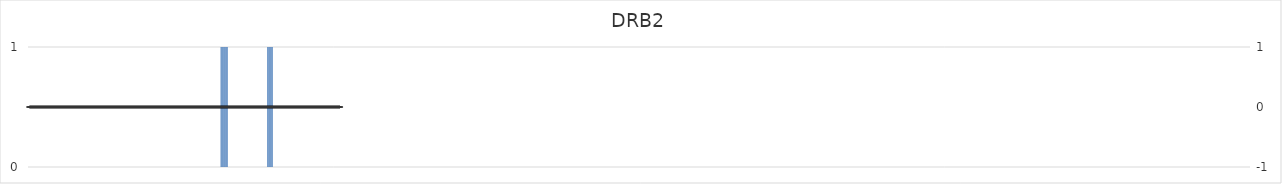
| Category | DRB2 |
|---|---|
| 1.0 | 0 |
| 2.0 | 0 |
| 3.0 | 0 |
| 4.0 | 0 |
| 5.0 | 0 |
| 6.0 | 0 |
| 7.0 | 0 |
| 8.0 | 0 |
| 9.0 | 0 |
| 10.0 | 0 |
| 11.0 | 0 |
| 12.0 | 0 |
| 13.0 | 0 |
| 14.0 | 0 |
| 15.0 | 0 |
| 16.0 | 0 |
| 17.0 | 0 |
| 18.0 | 0 |
| 19.0 | 0 |
| 20.0 | 0 |
| 21.0 | 0 |
| 22.0 | 0 |
| 23.0 | 0 |
| 24.0 | 0 |
| 25.0 | 0 |
| 26.0 | 0 |
| 27.0 | 0 |
| 28.0 | 0 |
| 29.0 | 0 |
| 30.0 | 0 |
| 31.0 | 0 |
| 32.0 | 0 |
| 33.0 | 0 |
| 34.0 | 0 |
| 35.0 | 0 |
| 36.0 | 0 |
| 37.0 | 0 |
| 38.0 | 0 |
| 39.0 | 0 |
| 40.0 | 0 |
| 41.0 | 0 |
| 42.0 | 0 |
| 43.0 | 0 |
| 44.0 | 0 |
| 45.0 | 0 |
| 46.0 | 0 |
| 47.0 | 0 |
| 48.0 | 0 |
| 49.0 | 0 |
| 50.0 | 0 |
| 51.0 | 0 |
| 52.0 | 0 |
| 53.0 | 0 |
| 54.0 | 0 |
| 55.0 | 0 |
| 56.0 | 0 |
| 57.0 | 0 |
| 58.0 | 0 |
| 59.0 | 0 |
| 60.0 | 0 |
| 61.0 | 0 |
| 62.0 | 0 |
| 63.0 | 0 |
| 64.0 | 0 |
| 65.0 | 0 |
| 66.0 | 0 |
| 67.0 | 0 |
| 68.0 | 0 |
| 69.0 | 0 |
| 70.0 | 0 |
| 71.0 | 0 |
| 72.0 | 0 |
| 73.0 | 0 |
| 74.0 | 0 |
| 75.0 | 0 |
| 76.0 | 0 |
| 77.0 | 0 |
| 78.0 | 0 |
| 79.0 | 0 |
| 80.0 | 0 |
| 81.0 | 0 |
| 82.0 | 0 |
| 83.0 | 0 |
| 84.0 | 0 |
| 85.0 | 0 |
| 86.0 | 0 |
| 87.0 | 0 |
| 88.0 | 0 |
| 89.0 | 0 |
| 90.0 | 0 |
| 91.0 | 0 |
| 92.0 | 0 |
| 93.0 | 0 |
| 94.0 | 0 |
| 95.0 | 0 |
| 96.0 | 0 |
| 97.0 | 0 |
| 98.0 | 0 |
| 99.0 | 0 |
| 100.0 | 0 |
| 101.0 | 0 |
| 102.0 | 0 |
| 103.0 | 0 |
| 104.0 | 0 |
| 105.0 | 0 |
| 106.0 | 0 |
| 107.0 | 0 |
| 108.0 | 0 |
| 109.0 | 0 |
| 110.0 | 0 |
| 111.0 | 0 |
| 112.0 | 0 |
| 113.0 | 0 |
| 114.0 | 0 |
| 115.0 | 0 |
| 116.0 | 0 |
| 117.0 | 0 |
| 118.0 | 0 |
| 119.0 | 0 |
| 120.0 | 0 |
| 121.0 | 0 |
| 122.0 | 0 |
| 123.0 | 0 |
| 124.0 | 0 |
| 125.0 | 0 |
| 126.0 | 0 |
| 127.0 | 0 |
| 128.0 | 0 |
| 129.0 | 0 |
| 130.0 | 0 |
| 131.0 | 0 |
| 132.0 | 0 |
| 133.0 | 0 |
| 134.0 | 0 |
| 135.0 | 0 |
| 136.0 | 0 |
| 137.0 | 0 |
| 138.0 | 0 |
| 139.0 | 0 |
| 140.0 | 0 |
| 141.0 | 0 |
| 142.0 | 0 |
| 143.0 | 0 |
| 144.0 | 0 |
| 145.0 | 0 |
| 146.0 | 0 |
| 147.0 | 0 |
| 148.0 | 0 |
| 149.0 | 0 |
| 150.0 | 0 |
| 151.0 | 0 |
| 152.0 | 0 |
| 153.0 | 0 |
| 154.0 | 0 |
| 155.0 | 0 |
| 156.0 | 0 |
| 157.0 | 0 |
| 158.0 | 0 |
| 159.0 | 0 |
| 160.0 | 0 |
| 161.0 | 0 |
| 162.0 | 0 |
| 163.0 | 0 |
| 164.0 | 0 |
| 165.0 | 0 |
| 166.0 | 0 |
| 167.0 | 0 |
| 168.0 | 0 |
| 169.0 | 0 |
| 170.0 | 0 |
| 171.0 | 0 |
| 172.0 | 0 |
| 173.0 | 0 |
| 174.0 | 0 |
| 175.0 | 0 |
| 176.0 | 0 |
| 177.0 | 0 |
| 178.0 | 0 |
| 179.0 | 0 |
| 180.0 | 0 |
| 181.0 | 0 |
| 182.0 | 0 |
| 183.0 | 0 |
| 184.0 | 0 |
| 185.0 | 0 |
| 186.0 | 0 |
| 187.0 | 0 |
| 188.0 | 0 |
| 189.0 | 0 |
| 190.0 | 0 |
| 191.0 | 0 |
| 192.0 | 0 |
| 193.0 | 0 |
| 194.0 | 0 |
| 195.0 | 0 |
| 196.0 | 0 |
| 197.0 | 0 |
| 198.0 | 0 |
| 199.0 | 0 |
| 200.0 | 0 |
| 201.0 | 0 |
| 202.0 | 0 |
| 203.0 | 0 |
| 204.0 | 0 |
| 205.0 | 0 |
| 206.0 | 0 |
| 207.0 | 0 |
| 208.0 | 0 |
| 209.0 | 0 |
| 210.0 | 0 |
| 211.0 | 0 |
| 212.0 | 0 |
| 213.0 | 0 |
| 214.0 | 0 |
| 215.0 | 0 |
| 216.0 | 0 |
| 217.0 | 0 |
| 218.0 | 0 |
| 219.0 | 0 |
| 220.0 | 0 |
| 221.0 | 0 |
| 222.0 | 0 |
| 223.0 | 0 |
| 224.0 | 0 |
| 225.0 | 0 |
| 226.0 | 0 |
| 227.0 | 0 |
| 228.0 | 0 |
| 229.0 | 0 |
| 230.0 | 0 |
| 231.0 | 0 |
| 232.0 | 0 |
| 233.0 | 0 |
| 234.0 | 0 |
| 235.0 | 0 |
| 236.0 | 0 |
| 237.0 | 0 |
| 238.0 | 0 |
| 239.0 | 0 |
| 240.0 | 0 |
| 241.0 | 0 |
| 242.0 | 0 |
| 243.0 | 0 |
| 244.0 | 0 |
| 245.0 | 0 |
| 246.0 | 0 |
| 247.0 | 0 |
| 248.0 | 0 |
| 249.0 | 0 |
| 250.0 | 0 |
| 251.0 | 0 |
| 252.0 | 0 |
| 253.0 | 0 |
| 254.0 | 0 |
| 255.0 | 0 |
| 256.0 | 0 |
| 257.0 | 0 |
| 258.0 | 0 |
| 259.0 | 0 |
| 260.0 | 0 |
| 261.0 | 0 |
| 262.0 | 0 |
| 263.0 | 0 |
| 264.0 | 0 |
| 265.0 | 0 |
| 266.0 | 0 |
| 267.0 | 0 |
| 268.0 | 0 |
| 269.0 | 0 |
| 270.0 | 1 |
| 271.0 | 1 |
| 272.0 | 1 |
| 273.0 | 1 |
| 274.0 | 1 |
| 275.0 | 1 |
| 276.0 | 1 |
| 277.0 | 1 |
| 278.0 | 1 |
| 279.0 | 1 |
| 280.0 | 0 |
| 281.0 | 0 |
| 282.0 | 0 |
| 283.0 | 0 |
| 284.0 | 0 |
| 285.0 | 0 |
| 286.0 | 0 |
| 287.0 | 0 |
| 288.0 | 0 |
| 289.0 | 0 |
| 290.0 | 0 |
| 291.0 | 0 |
| 292.0 | 0 |
| 293.0 | 0 |
| 294.0 | 0 |
| 295.0 | 0 |
| 296.0 | 0 |
| 297.0 | 0 |
| 298.0 | 0 |
| 299.0 | 0 |
| 300.0 | 0 |
| 301.0 | 0 |
| 302.0 | 0 |
| 303.0 | 0 |
| 304.0 | 0 |
| 305.0 | 0 |
| 306.0 | 0 |
| 307.0 | 0 |
| 308.0 | 0 |
| 309.0 | 0 |
| 310.0 | 0 |
| 311.0 | 0 |
| 312.0 | 0 |
| 313.0 | 0 |
| 314.0 | 0 |
| 315.0 | 0 |
| 316.0 | 0 |
| 317.0 | 0 |
| 318.0 | 0 |
| 319.0 | 0 |
| 320.0 | 0 |
| 321.0 | 0 |
| 322.0 | 0 |
| 323.0 | 0 |
| 324.0 | 0 |
| 325.0 | 0 |
| 326.0 | 0 |
| 327.0 | 0 |
| 328.0 | 0 |
| 329.0 | 0 |
| 330.0 | 0 |
| 331.0 | 0 |
| 332.0 | 0 |
| 333.0 | 0 |
| 334.0 | 0 |
| 335.0 | 1 |
| 336.0 | 1 |
| 337.0 | 1 |
| 338.0 | 1 |
| 339.0 | 1 |
| 340.0 | 1 |
| 341.0 | 1 |
| 342.0 | 1 |
| 343.0 | 0 |
| 344.0 | 0 |
| 345.0 | 0 |
| 346.0 | 0 |
| 347.0 | 0 |
| 348.0 | 0 |
| 349.0 | 0 |
| 350.0 | 0 |
| 351.0 | 0 |
| 352.0 | 0 |
| 353.0 | 0 |
| 354.0 | 0 |
| 355.0 | 0 |
| 356.0 | 0 |
| 357.0 | 0 |
| 358.0 | 0 |
| 359.0 | 0 |
| 360.0 | 0 |
| 361.0 | 0 |
| 362.0 | 0 |
| 363.0 | 0 |
| 364.0 | 0 |
| 365.0 | 0 |
| 366.0 | 0 |
| 367.0 | 0 |
| 368.0 | 0 |
| 369.0 | 0 |
| 370.0 | 0 |
| 371.0 | 0 |
| 372.0 | 0 |
| 373.0 | 0 |
| 374.0 | 0 |
| 375.0 | 0 |
| 376.0 | 0 |
| 377.0 | 0 |
| 378.0 | 0 |
| 379.0 | 0 |
| 380.0 | 0 |
| 381.0 | 0 |
| 382.0 | 0 |
| 383.0 | 0 |
| 384.0 | 0 |
| 385.0 | 0 |
| 386.0 | 0 |
| 387.0 | 0 |
| 388.0 | 0 |
| 389.0 | 0 |
| 390.0 | 0 |
| 391.0 | 0 |
| 392.0 | 0 |
| 393.0 | 0 |
| 394.0 | 0 |
| 395.0 | 0 |
| 396.0 | 0 |
| 397.0 | 0 |
| 398.0 | 0 |
| 399.0 | 0 |
| 400.0 | 0 |
| 401.0 | 0 |
| 402.0 | 0 |
| 403.0 | 0 |
| 404.0 | 0 |
| 405.0 | 0 |
| 406.0 | 0 |
| 407.0 | 0 |
| 408.0 | 0 |
| 409.0 | 0 |
| 410.0 | 0 |
| 411.0 | 0 |
| 412.0 | 0 |
| 413.0 | 0 |
| 414.0 | 0 |
| 415.0 | 0 |
| 416.0 | 0 |
| 417.0 | 0 |
| 418.0 | 0 |
| 419.0 | 0 |
| 420.0 | 0 |
| 421.0 | 0 |
| 422.0 | 0 |
| 423.0 | 0 |
| 424.0 | 0 |
| 425.0 | 0 |
| 426.0 | 0 |
| 427.0 | 0 |
| 428.0 | 0 |
| 429.0 | 0 |
| 430.0 | 0 |
| 431.0 | 0 |
| 432.0 | 0 |
| 433.0 | 0 |
| 434.0 | 0 |
| 435.0 | 0 |
| 436.0 | 0 |
| 437.0 | 0 |
| 438.0 | 0 |
| 439.0 | 0 |
| 440.0 | 0 |
| 441.0 | 0 |
| 442.0 | 0 |
| 443.0 | 0 |
| 444.0 | 0 |
| 445.0 | 0 |
| 446.0 | 0 |
| 447.0 | 0 |
| 448.0 | 0 |
| 449.0 | 0 |
| 450.0 | 0 |
| 451.0 | 0 |
| 452.0 | 0 |
| 453.0 | 0 |
| 454.0 | 0 |
| 455.0 | 0 |
| 456.0 | 0 |
| 457.0 | 0 |
| 458.0 | 0 |
| 459.0 | 0 |
| 460.0 | 0 |
| 461.0 | 0 |
| 462.0 | 0 |
| 463.0 | 0 |
| 464.0 | 0 |
| 465.0 | 0 |
| 466.0 | 0 |
| 467.0 | 0 |
| 468.0 | 0 |
| 469.0 | 0 |
| 470.0 | 0 |
| 471.0 | 0 |
| 472.0 | 0 |
| 473.0 | 0 |
| 474.0 | 0 |
| 475.0 | 0 |
| 476.0 | 0 |
| 477.0 | 0 |
| 478.0 | 0 |
| 479.0 | 0 |
| 480.0 | 0 |
| 481.0 | 0 |
| 482.0 | 0 |
| 483.0 | 0 |
| 484.0 | 0 |
| 485.0 | 0 |
| 486.0 | 0 |
| 487.0 | 0 |
| 488.0 | 0 |
| 489.0 | 0 |
| 490.0 | 0 |
| 491.0 | 0 |
| 492.0 | 0 |
| 493.0 | 0 |
| 494.0 | 0 |
| 495.0 | 0 |
| 496.0 | 0 |
| 497.0 | 0 |
| 498.0 | 0 |
| 499.0 | 0 |
| 500.0 | 0 |
| 501.0 | 0 |
| 502.0 | 0 |
| 503.0 | 0 |
| 504.0 | 0 |
| 505.0 | 0 |
| 506.0 | 0 |
| 507.0 | 0 |
| 508.0 | 0 |
| 509.0 | 0 |
| 510.0 | 0 |
| 511.0 | 0 |
| 512.0 | 0 |
| 513.0 | 0 |
| 514.0 | 0 |
| 515.0 | 0 |
| 516.0 | 0 |
| 517.0 | 0 |
| 518.0 | 0 |
| 519.0 | 0 |
| 520.0 | 0 |
| 521.0 | 0 |
| 522.0 | 0 |
| 523.0 | 0 |
| 524.0 | 0 |
| 525.0 | 0 |
| 526.0 | 0 |
| 527.0 | 0 |
| 528.0 | 0 |
| 529.0 | 0 |
| 530.0 | 0 |
| 531.0 | 0 |
| 532.0 | 0 |
| 533.0 | 0 |
| 534.0 | 0 |
| 535.0 | 0 |
| 536.0 | 0 |
| 537.0 | 0 |
| 538.0 | 0 |
| 539.0 | 0 |
| 540.0 | 0 |
| 541.0 | 0 |
| 542.0 | 0 |
| 543.0 | 0 |
| 544.0 | 0 |
| 545.0 | 0 |
| 546.0 | 0 |
| 547.0 | 0 |
| 548.0 | 0 |
| 549.0 | 0 |
| 550.0 | 0 |
| 551.0 | 0 |
| 552.0 | 0 |
| 553.0 | 0 |
| 554.0 | 0 |
| 555.0 | 0 |
| 556.0 | 0 |
| 557.0 | 0 |
| 558.0 | 0 |
| 559.0 | 0 |
| 560.0 | 0 |
| 561.0 | 0 |
| 562.0 | 0 |
| 563.0 | 0 |
| 564.0 | 0 |
| 565.0 | 0 |
| 566.0 | 0 |
| 567.0 | 0 |
| 568.0 | 0 |
| 569.0 | 0 |
| 570.0 | 0 |
| 571.0 | 0 |
| 572.0 | 0 |
| 573.0 | 0 |
| 574.0 | 0 |
| 575.0 | 0 |
| 576.0 | 0 |
| 577.0 | 0 |
| 578.0 | 0 |
| 579.0 | 0 |
| 580.0 | 0 |
| 581.0 | 0 |
| 582.0 | 0 |
| 583.0 | 0 |
| 584.0 | 0 |
| 585.0 | 0 |
| 586.0 | 0 |
| 587.0 | 0 |
| 588.0 | 0 |
| 589.0 | 0 |
| 590.0 | 0 |
| 591.0 | 0 |
| 592.0 | 0 |
| 593.0 | 0 |
| 594.0 | 0 |
| 595.0 | 0 |
| 596.0 | 0 |
| 597.0 | 0 |
| 598.0 | 0 |
| 599.0 | 0 |
| 600.0 | 0 |
| 601.0 | 0 |
| 602.0 | 0 |
| 603.0 | 0 |
| 604.0 | 0 |
| 605.0 | 0 |
| 606.0 | 0 |
| 607.0 | 0 |
| 608.0 | 0 |
| 609.0 | 0 |
| 610.0 | 0 |
| 611.0 | 0 |
| 612.0 | 0 |
| 613.0 | 0 |
| 614.0 | 0 |
| 615.0 | 0 |
| 616.0 | 0 |
| 617.0 | 0 |
| 618.0 | 0 |
| 619.0 | 0 |
| 620.0 | 0 |
| 621.0 | 0 |
| 622.0 | 0 |
| 623.0 | 0 |
| 624.0 | 0 |
| 625.0 | 0 |
| 626.0 | 0 |
| 627.0 | 0 |
| 628.0 | 0 |
| 629.0 | 0 |
| 630.0 | 0 |
| 631.0 | 0 |
| 632.0 | 0 |
| 633.0 | 0 |
| 634.0 | 0 |
| 635.0 | 0 |
| 636.0 | 0 |
| 637.0 | 0 |
| 638.0 | 0 |
| 639.0 | 0 |
| 640.0 | 0 |
| 641.0 | 0 |
| 642.0 | 0 |
| 643.0 | 0 |
| 644.0 | 0 |
| 645.0 | 0 |
| 646.0 | 0 |
| 647.0 | 0 |
| 648.0 | 0 |
| 649.0 | 0 |
| 650.0 | 0 |
| 651.0 | 0 |
| 652.0 | 0 |
| 653.0 | 0 |
| 654.0 | 0 |
| 655.0 | 0 |
| 656.0 | 0 |
| 657.0 | 0 |
| 658.0 | 0 |
| 659.0 | 0 |
| 660.0 | 0 |
| 661.0 | 0 |
| 662.0 | 0 |
| 663.0 | 0 |
| 664.0 | 0 |
| 665.0 | 0 |
| 666.0 | 0 |
| 667.0 | 0 |
| 668.0 | 0 |
| 669.0 | 0 |
| 670.0 | 0 |
| 671.0 | 0 |
| 672.0 | 0 |
| 673.0 | 0 |
| 674.0 | 0 |
| 675.0 | 0 |
| 676.0 | 0 |
| 677.0 | 0 |
| 678.0 | 0 |
| 679.0 | 0 |
| 680.0 | 0 |
| 681.0 | 0 |
| 682.0 | 0 |
| 683.0 | 0 |
| 684.0 | 0 |
| 685.0 | 0 |
| 686.0 | 0 |
| 687.0 | 0 |
| 688.0 | 0 |
| 689.0 | 0 |
| 690.0 | 0 |
| 691.0 | 0 |
| 692.0 | 0 |
| 693.0 | 0 |
| 694.0 | 0 |
| 695.0 | 0 |
| 696.0 | 0 |
| 697.0 | 0 |
| 698.0 | 0 |
| 699.0 | 0 |
| 700.0 | 0 |
| 701.0 | 0 |
| 702.0 | 0 |
| 703.0 | 0 |
| 704.0 | 0 |
| 705.0 | 0 |
| 706.0 | 0 |
| 707.0 | 0 |
| 708.0 | 0 |
| 709.0 | 0 |
| 710.0 | 0 |
| 711.0 | 0 |
| 712.0 | 0 |
| 713.0 | 0 |
| 714.0 | 0 |
| 715.0 | 0 |
| 716.0 | 0 |
| 717.0 | 0 |
| 718.0 | 0 |
| 719.0 | 0 |
| 720.0 | 0 |
| 721.0 | 0 |
| 722.0 | 0 |
| 723.0 | 0 |
| 724.0 | 0 |
| 725.0 | 0 |
| 726.0 | 0 |
| 727.0 | 0 |
| 728.0 | 0 |
| 729.0 | 0 |
| 730.0 | 0 |
| 731.0 | 0 |
| 732.0 | 0 |
| 733.0 | 0 |
| 734.0 | 0 |
| 735.0 | 0 |
| 736.0 | 0 |
| 737.0 | 0 |
| 738.0 | 0 |
| 739.0 | 0 |
| 740.0 | 0 |
| 741.0 | 0 |
| 742.0 | 0 |
| 743.0 | 0 |
| 744.0 | 0 |
| 745.0 | 0 |
| 746.0 | 0 |
| 747.0 | 0 |
| 748.0 | 0 |
| 749.0 | 0 |
| 750.0 | 0 |
| 751.0 | 0 |
| 752.0 | 0 |
| 753.0 | 0 |
| 754.0 | 0 |
| 755.0 | 0 |
| 756.0 | 0 |
| 757.0 | 0 |
| 758.0 | 0 |
| 759.0 | 0 |
| 760.0 | 0 |
| 761.0 | 0 |
| 762.0 | 0 |
| 763.0 | 0 |
| 764.0 | 0 |
| 765.0 | 0 |
| 766.0 | 0 |
| 767.0 | 0 |
| 768.0 | 0 |
| 769.0 | 0 |
| 770.0 | 0 |
| 771.0 | 0 |
| 772.0 | 0 |
| 773.0 | 0 |
| 774.0 | 0 |
| 775.0 | 0 |
| 776.0 | 0 |
| 777.0 | 0 |
| 778.0 | 0 |
| 779.0 | 0 |
| 780.0 | 0 |
| 781.0 | 0 |
| 782.0 | 0 |
| 783.0 | 0 |
| 784.0 | 0 |
| 785.0 | 0 |
| 786.0 | 0 |
| 787.0 | 0 |
| 788.0 | 0 |
| 789.0 | 0 |
| 790.0 | 0 |
| 791.0 | 0 |
| 792.0 | 0 |
| 793.0 | 0 |
| 794.0 | 0 |
| 795.0 | 0 |
| 796.0 | 0 |
| 797.0 | 0 |
| 798.0 | 0 |
| 799.0 | 0 |
| 800.0 | 0 |
| 801.0 | 0 |
| 802.0 | 0 |
| 803.0 | 0 |
| 804.0 | 0 |
| 805.0 | 0 |
| 806.0 | 0 |
| 807.0 | 0 |
| 808.0 | 0 |
| 809.0 | 0 |
| 810.0 | 0 |
| 811.0 | 0 |
| 812.0 | 0 |
| 813.0 | 0 |
| 814.0 | 0 |
| 815.0 | 0 |
| 816.0 | 0 |
| 817.0 | 0 |
| 818.0 | 0 |
| 819.0 | 0 |
| 820.0 | 0 |
| 821.0 | 0 |
| 822.0 | 0 |
| 823.0 | 0 |
| 824.0 | 0 |
| 825.0 | 0 |
| 826.0 | 0 |
| 827.0 | 0 |
| 828.0 | 0 |
| 829.0 | 0 |
| 830.0 | 0 |
| 831.0 | 0 |
| 832.0 | 0 |
| 833.0 | 0 |
| 834.0 | 0 |
| 835.0 | 0 |
| 836.0 | 0 |
| 837.0 | 0 |
| 838.0 | 0 |
| 839.0 | 0 |
| 840.0 | 0 |
| 841.0 | 0 |
| 842.0 | 0 |
| 843.0 | 0 |
| 844.0 | 0 |
| 845.0 | 0 |
| 846.0 | 0 |
| 847.0 | 0 |
| 848.0 | 0 |
| 849.0 | 0 |
| 850.0 | 0 |
| 851.0 | 0 |
| 852.0 | 0 |
| 853.0 | 0 |
| 854.0 | 0 |
| 855.0 | 0 |
| 856.0 | 0 |
| 857.0 | 0 |
| 858.0 | 0 |
| 859.0 | 0 |
| 860.0 | 0 |
| 861.0 | 0 |
| 862.0 | 0 |
| 863.0 | 0 |
| 864.0 | 0 |
| 865.0 | 0 |
| 866.0 | 0 |
| 867.0 | 0 |
| 868.0 | 0 |
| 869.0 | 0 |
| 870.0 | 0 |
| 871.0 | 0 |
| 872.0 | 0 |
| 873.0 | 0 |
| 874.0 | 0 |
| 875.0 | 0 |
| 876.0 | 0 |
| 877.0 | 0 |
| 878.0 | 0 |
| 879.0 | 0 |
| 880.0 | 0 |
| 881.0 | 0 |
| 882.0 | 0 |
| 883.0 | 0 |
| 884.0 | 0 |
| 885.0 | 0 |
| 886.0 | 0 |
| 887.0 | 0 |
| 888.0 | 0 |
| 889.0 | 0 |
| 890.0 | 0 |
| 891.0 | 0 |
| 892.0 | 0 |
| 893.0 | 0 |
| 894.0 | 0 |
| 895.0 | 0 |
| 896.0 | 0 |
| 897.0 | 0 |
| 898.0 | 0 |
| 899.0 | 0 |
| 900.0 | 0 |
| 901.0 | 0 |
| 902.0 | 0 |
| 903.0 | 0 |
| 904.0 | 0 |
| 905.0 | 0 |
| 906.0 | 0 |
| 907.0 | 0 |
| 908.0 | 0 |
| 909.0 | 0 |
| 910.0 | 0 |
| 911.0 | 0 |
| 912.0 | 0 |
| 913.0 | 0 |
| 914.0 | 0 |
| 915.0 | 0 |
| 916.0 | 0 |
| 917.0 | 0 |
| 918.0 | 0 |
| 919.0 | 0 |
| 920.0 | 0 |
| 921.0 | 0 |
| 922.0 | 0 |
| 923.0 | 0 |
| 924.0 | 0 |
| 925.0 | 0 |
| 926.0 | 0 |
| 927.0 | 0 |
| 928.0 | 0 |
| 929.0 | 0 |
| 930.0 | 0 |
| 931.0 | 0 |
| 932.0 | 0 |
| 933.0 | 0 |
| 934.0 | 0 |
| 935.0 | 0 |
| 936.0 | 0 |
| 937.0 | 0 |
| 938.0 | 0 |
| 939.0 | 0 |
| 940.0 | 0 |
| 941.0 | 0 |
| 942.0 | 0 |
| 943.0 | 0 |
| 944.0 | 0 |
| 945.0 | 0 |
| 946.0 | 0 |
| 947.0 | 0 |
| 948.0 | 0 |
| 949.0 | 0 |
| 950.0 | 0 |
| 951.0 | 0 |
| 952.0 | 0 |
| 953.0 | 0 |
| 954.0 | 0 |
| 955.0 | 0 |
| 956.0 | 0 |
| 957.0 | 0 |
| 958.0 | 0 |
| 959.0 | 0 |
| 960.0 | 0 |
| 961.0 | 0 |
| 962.0 | 0 |
| 963.0 | 0 |
| 964.0 | 0 |
| 965.0 | 0 |
| 966.0 | 0 |
| 967.0 | 0 |
| 968.0 | 0 |
| 969.0 | 0 |
| 970.0 | 0 |
| 971.0 | 0 |
| 972.0 | 0 |
| 973.0 | 0 |
| 974.0 | 0 |
| 975.0 | 0 |
| 976.0 | 0 |
| 977.0 | 0 |
| 978.0 | 0 |
| 979.0 | 0 |
| 980.0 | 0 |
| 981.0 | 0 |
| 982.0 | 0 |
| 983.0 | 0 |
| 984.0 | 0 |
| 985.0 | 0 |
| 986.0 | 0 |
| 987.0 | 0 |
| 988.0 | 0 |
| 989.0 | 0 |
| 990.0 | 0 |
| 991.0 | 0 |
| 992.0 | 0 |
| 993.0 | 0 |
| 994.0 | 0 |
| 995.0 | 0 |
| 996.0 | 0 |
| 997.0 | 0 |
| 998.0 | 0 |
| 999.0 | 0 |
| 1000.0 | 0 |
| 1001.0 | 0 |
| 1002.0 | 0 |
| 1003.0 | 0 |
| 1004.0 | 0 |
| 1005.0 | 0 |
| 1006.0 | 0 |
| 1007.0 | 0 |
| 1008.0 | 0 |
| 1009.0 | 0 |
| 1010.0 | 0 |
| 1011.0 | 0 |
| 1012.0 | 0 |
| 1013.0 | 0 |
| 1014.0 | 0 |
| 1015.0 | 0 |
| 1016.0 | 0 |
| 1017.0 | 0 |
| 1018.0 | 0 |
| 1019.0 | 0 |
| 1020.0 | 0 |
| 1021.0 | 0 |
| 1022.0 | 0 |
| 1023.0 | 0 |
| 1024.0 | 0 |
| 1025.0 | 0 |
| 1026.0 | 0 |
| 1027.0 | 0 |
| 1028.0 | 0 |
| 1029.0 | 0 |
| 1030.0 | 0 |
| 1031.0 | 0 |
| 1032.0 | 0 |
| 1033.0 | 0 |
| 1034.0 | 0 |
| 1035.0 | 0 |
| 1036.0 | 0 |
| 1037.0 | 0 |
| 1038.0 | 0 |
| 1039.0 | 0 |
| 1040.0 | 0 |
| 1041.0 | 0 |
| 1042.0 | 0 |
| 1043.0 | 0 |
| 1044.0 | 0 |
| 1045.0 | 0 |
| 1046.0 | 0 |
| 1047.0 | 0 |
| 1048.0 | 0 |
| 1049.0 | 0 |
| 1050.0 | 0 |
| 1051.0 | 0 |
| 1052.0 | 0 |
| 1053.0 | 0 |
| 1054.0 | 0 |
| 1055.0 | 0 |
| 1056.0 | 0 |
| 1057.0 | 0 |
| 1058.0 | 0 |
| 1059.0 | 0 |
| 1060.0 | 0 |
| 1061.0 | 0 |
| 1062.0 | 0 |
| 1063.0 | 0 |
| 1064.0 | 0 |
| 1065.0 | 0 |
| 1066.0 | 0 |
| 1067.0 | 0 |
| 1068.0 | 0 |
| 1069.0 | 0 |
| 1070.0 | 0 |
| 1071.0 | 0 |
| 1072.0 | 0 |
| 1073.0 | 0 |
| 1074.0 | 0 |
| 1075.0 | 0 |
| 1076.0 | 0 |
| 1077.0 | 0 |
| 1078.0 | 0 |
| 1079.0 | 0 |
| 1080.0 | 0 |
| 1081.0 | 0 |
| 1082.0 | 0 |
| 1083.0 | 0 |
| 1084.0 | 0 |
| 1085.0 | 0 |
| 1086.0 | 0 |
| 1087.0 | 0 |
| 1088.0 | 0 |
| 1089.0 | 0 |
| 1090.0 | 0 |
| 1091.0 | 0 |
| 1092.0 | 0 |
| 1093.0 | 0 |
| 1094.0 | 0 |
| 1095.0 | 0 |
| 1096.0 | 0 |
| 1097.0 | 0 |
| 1098.0 | 0 |
| 1099.0 | 0 |
| 1100.0 | 0 |
| 1101.0 | 0 |
| 1102.0 | 0 |
| 1103.0 | 0 |
| 1104.0 | 0 |
| 1105.0 | 0 |
| 1106.0 | 0 |
| 1107.0 | 0 |
| 1108.0 | 0 |
| 1109.0 | 0 |
| 1110.0 | 0 |
| 1111.0 | 0 |
| 1112.0 | 0 |
| 1113.0 | 0 |
| 1114.0 | 0 |
| 1115.0 | 0 |
| 1116.0 | 0 |
| 1117.0 | 0 |
| 1118.0 | 0 |
| 1119.0 | 0 |
| 1120.0 | 0 |
| 1121.0 | 0 |
| 1122.0 | 0 |
| 1123.0 | 0 |
| 1124.0 | 0 |
| 1125.0 | 0 |
| 1126.0 | 0 |
| 1127.0 | 0 |
| 1128.0 | 0 |
| 1129.0 | 0 |
| 1130.0 | 0 |
| 1131.0 | 0 |
| 1132.0 | 0 |
| 1133.0 | 0 |
| 1134.0 | 0 |
| 1135.0 | 0 |
| 1136.0 | 0 |
| 1137.0 | 0 |
| 1138.0 | 0 |
| 1139.0 | 0 |
| 1140.0 | 0 |
| 1141.0 | 0 |
| 1142.0 | 0 |
| 1143.0 | 0 |
| 1144.0 | 0 |
| 1145.0 | 0 |
| 1146.0 | 0 |
| 1147.0 | 0 |
| 1148.0 | 0 |
| 1149.0 | 0 |
| 1150.0 | 0 |
| 1151.0 | 0 |
| 1152.0 | 0 |
| 1153.0 | 0 |
| 1154.0 | 0 |
| 1155.0 | 0 |
| 1156.0 | 0 |
| 1157.0 | 0 |
| 1158.0 | 0 |
| 1159.0 | 0 |
| 1160.0 | 0 |
| 1161.0 | 0 |
| 1162.0 | 0 |
| 1163.0 | 0 |
| 1164.0 | 0 |
| 1165.0 | 0 |
| 1166.0 | 0 |
| 1167.0 | 0 |
| 1168.0 | 0 |
| 1169.0 | 0 |
| 1170.0 | 0 |
| 1171.0 | 0 |
| 1172.0 | 0 |
| 1173.0 | 0 |
| 1174.0 | 0 |
| 1175.0 | 0 |
| 1176.0 | 0 |
| 1177.0 | 0 |
| 1178.0 | 0 |
| 1179.0 | 0 |
| 1180.0 | 0 |
| 1181.0 | 0 |
| 1182.0 | 0 |
| 1183.0 | 0 |
| 1184.0 | 0 |
| 1185.0 | 0 |
| 1186.0 | 0 |
| 1187.0 | 0 |
| 1188.0 | 0 |
| 1189.0 | 0 |
| 1190.0 | 0 |
| 1191.0 | 0 |
| 1192.0 | 0 |
| 1193.0 | 0 |
| 1194.0 | 0 |
| 1195.0 | 0 |
| 1196.0 | 0 |
| 1197.0 | 0 |
| 1198.0 | 0 |
| 1199.0 | 0 |
| 1200.0 | 0 |
| 1201.0 | 0 |
| 1202.0 | 0 |
| 1203.0 | 0 |
| 1204.0 | 0 |
| 1205.0 | 0 |
| 1206.0 | 0 |
| 1207.0 | 0 |
| 1208.0 | 0 |
| 1209.0 | 0 |
| 1210.0 | 0 |
| 1211.0 | 0 |
| 1212.0 | 0 |
| 1213.0 | 0 |
| 1214.0 | 0 |
| 1215.0 | 0 |
| 1216.0 | 0 |
| 1217.0 | 0 |
| 1218.0 | 0 |
| 1219.0 | 0 |
| 1220.0 | 0 |
| 1221.0 | 0 |
| 1222.0 | 0 |
| 1223.0 | 0 |
| 1224.0 | 0 |
| 1225.0 | 0 |
| 1226.0 | 0 |
| 1227.0 | 0 |
| 1228.0 | 0 |
| 1229.0 | 0 |
| 1230.0 | 0 |
| 1231.0 | 0 |
| 1232.0 | 0 |
| 1233.0 | 0 |
| 1234.0 | 0 |
| 1235.0 | 0 |
| 1236.0 | 0 |
| 1237.0 | 0 |
| 1238.0 | 0 |
| 1239.0 | 0 |
| 1240.0 | 0 |
| 1241.0 | 0 |
| 1242.0 | 0 |
| 1243.0 | 0 |
| 1244.0 | 0 |
| 1245.0 | 0 |
| 1246.0 | 0 |
| 1247.0 | 0 |
| 1248.0 | 0 |
| 1249.0 | 0 |
| 1250.0 | 0 |
| 1251.0 | 0 |
| 1252.0 | 0 |
| 1253.0 | 0 |
| 1254.0 | 0 |
| 1255.0 | 0 |
| 1256.0 | 0 |
| 1257.0 | 0 |
| 1258.0 | 0 |
| 1259.0 | 0 |
| 1260.0 | 0 |
| 1261.0 | 0 |
| 1262.0 | 0 |
| 1263.0 | 0 |
| 1264.0 | 0 |
| 1265.0 | 0 |
| 1266.0 | 0 |
| 1267.0 | 0 |
| 1268.0 | 0 |
| 1269.0 | 0 |
| 1270.0 | 0 |
| 1271.0 | 0 |
| 1272.0 | 0 |
| 1273.0 | 0 |
| 1274.0 | 0 |
| 1275.0 | 0 |
| 1276.0 | 0 |
| 1277.0 | 0 |
| 1278.0 | 0 |
| 1279.0 | 0 |
| 1280.0 | 0 |
| 1281.0 | 0 |
| 1282.0 | 0 |
| 1283.0 | 0 |
| 1284.0 | 0 |
| 1285.0 | 0 |
| 1286.0 | 0 |
| 1287.0 | 0 |
| 1288.0 | 0 |
| 1289.0 | 0 |
| 1290.0 | 0 |
| 1291.0 | 0 |
| 1292.0 | 0 |
| 1293.0 | 0 |
| 1294.0 | 0 |
| 1295.0 | 0 |
| 1296.0 | 0 |
| 1297.0 | 0 |
| 1298.0 | 0 |
| 1299.0 | 0 |
| 1300.0 | 0 |
| 1301.0 | 0 |
| 1302.0 | 0 |
| 1303.0 | 0 |
| 1304.0 | 0 |
| 1305.0 | 0 |
| 1306.0 | 0 |
| 1307.0 | 0 |
| 1308.0 | 0 |
| 1309.0 | 0 |
| 1310.0 | 0 |
| 1311.0 | 0 |
| 1312.0 | 0 |
| 1313.0 | 0 |
| 1314.0 | 0 |
| 1315.0 | 0 |
| 1316.0 | 0 |
| 1317.0 | 0 |
| 1318.0 | 0 |
| 1319.0 | 0 |
| 1320.0 | 0 |
| 1321.0 | 0 |
| 1322.0 | 0 |
| 1323.0 | 0 |
| 1324.0 | 0 |
| 1325.0 | 0 |
| 1326.0 | 0 |
| 1327.0 | 0 |
| 1328.0 | 0 |
| 1329.0 | 0 |
| 1330.0 | 0 |
| 1331.0 | 0 |
| 1332.0 | 0 |
| 1333.0 | 0 |
| 1334.0 | 0 |
| 1335.0 | 0 |
| 1336.0 | 0 |
| 1337.0 | 0 |
| 1338.0 | 0 |
| 1339.0 | 0 |
| 1340.0 | 0 |
| 1341.0 | 0 |
| 1342.0 | 0 |
| 1343.0 | 0 |
| 1344.0 | 0 |
| 1345.0 | 0 |
| 1346.0 | 0 |
| 1347.0 | 0 |
| 1348.0 | 0 |
| 1349.0 | 0 |
| 1350.0 | 0 |
| 1351.0 | 0 |
| 1352.0 | 0 |
| 1353.0 | 0 |
| 1354.0 | 0 |
| 1355.0 | 0 |
| 1356.0 | 0 |
| 1357.0 | 0 |
| 1358.0 | 0 |
| 1359.0 | 0 |
| 1360.0 | 0 |
| 1361.0 | 0 |
| 1362.0 | 0 |
| 1363.0 | 0 |
| 1364.0 | 0 |
| 1365.0 | 0 |
| 1366.0 | 0 |
| 1367.0 | 0 |
| 1368.0 | 0 |
| 1369.0 | 0 |
| 1370.0 | 0 |
| 1371.0 | 0 |
| 1372.0 | 0 |
| 1373.0 | 0 |
| 1374.0 | 0 |
| 1375.0 | 0 |
| 1376.0 | 0 |
| 1377.0 | 0 |
| 1378.0 | 0 |
| 1379.0 | 0 |
| 1380.0 | 0 |
| 1381.0 | 0 |
| 1382.0 | 0 |
| 1383.0 | 0 |
| 1384.0 | 0 |
| 1385.0 | 0 |
| 1386.0 | 0 |
| 1387.0 | 0 |
| 1388.0 | 0 |
| 1389.0 | 0 |
| 1390.0 | 0 |
| 1391.0 | 0 |
| 1392.0 | 0 |
| 1393.0 | 0 |
| 1394.0 | 0 |
| 1395.0 | 0 |
| 1396.0 | 0 |
| 1397.0 | 0 |
| 1398.0 | 0 |
| 1399.0 | 0 |
| 1400.0 | 0 |
| 1401.0 | 0 |
| 1402.0 | 0 |
| 1403.0 | 0 |
| 1404.0 | 0 |
| 1405.0 | 0 |
| 1406.0 | 0 |
| 1407.0 | 0 |
| 1408.0 | 0 |
| 1409.0 | 0 |
| 1410.0 | 0 |
| 1411.0 | 0 |
| 1412.0 | 0 |
| 1413.0 | 0 |
| 1414.0 | 0 |
| 1415.0 | 0 |
| 1416.0 | 0 |
| 1417.0 | 0 |
| 1418.0 | 0 |
| 1419.0 | 0 |
| 1420.0 | 0 |
| 1421.0 | 0 |
| 1422.0 | 0 |
| 1423.0 | 0 |
| 1424.0 | 0 |
| 1425.0 | 0 |
| 1426.0 | 0 |
| 1427.0 | 0 |
| 1428.0 | 0 |
| 1429.0 | 0 |
| 1430.0 | 0 |
| 1431.0 | 0 |
| 1432.0 | 0 |
| 1433.0 | 0 |
| 1434.0 | 0 |
| 1435.0 | 0 |
| 1436.0 | 0 |
| 1437.0 | 0 |
| 1438.0 | 0 |
| 1439.0 | 0 |
| 1440.0 | 0 |
| 1441.0 | 0 |
| 1442.0 | 0 |
| 1443.0 | 0 |
| 1444.0 | 0 |
| 1445.0 | 0 |
| 1446.0 | 0 |
| 1447.0 | 0 |
| 1448.0 | 0 |
| 1449.0 | 0 |
| 1450.0 | 0 |
| 1451.0 | 0 |
| 1452.0 | 0 |
| 1453.0 | 0 |
| 1454.0 | 0 |
| 1455.0 | 0 |
| 1456.0 | 0 |
| 1457.0 | 0 |
| 1458.0 | 0 |
| 1459.0 | 0 |
| 1460.0 | 0 |
| 1461.0 | 0 |
| 1462.0 | 0 |
| 1463.0 | 0 |
| 1464.0 | 0 |
| 1465.0 | 0 |
| 1466.0 | 0 |
| 1467.0 | 0 |
| 1468.0 | 0 |
| 1469.0 | 0 |
| 1470.0 | 0 |
| 1471.0 | 0 |
| 1472.0 | 0 |
| 1473.0 | 0 |
| 1474.0 | 0 |
| 1475.0 | 0 |
| 1476.0 | 0 |
| 1477.0 | 0 |
| 1478.0 | 0 |
| 1479.0 | 0 |
| 1480.0 | 0 |
| 1481.0 | 0 |
| 1482.0 | 0 |
| 1483.0 | 0 |
| 1484.0 | 0 |
| 1485.0 | 0 |
| 1486.0 | 0 |
| 1487.0 | 0 |
| 1488.0 | 0 |
| 1489.0 | 0 |
| 1490.0 | 0 |
| 1491.0 | 0 |
| 1492.0 | 0 |
| 1493.0 | 0 |
| 1494.0 | 0 |
| 1495.0 | 0 |
| 1496.0 | 0 |
| 1497.0 | 0 |
| 1498.0 | 0 |
| 1499.0 | 0 |
| 1500.0 | 0 |
| 1501.0 | 0 |
| 1502.0 | 0 |
| 1503.0 | 0 |
| 1504.0 | 0 |
| 1505.0 | 0 |
| 1506.0 | 0 |
| 1507.0 | 0 |
| 1508.0 | 0 |
| 1509.0 | 0 |
| 1510.0 | 0 |
| 1511.0 | 0 |
| 1512.0 | 0 |
| 1513.0 | 0 |
| 1514.0 | 0 |
| 1515.0 | 0 |
| 1516.0 | 0 |
| 1517.0 | 0 |
| 1518.0 | 0 |
| 1519.0 | 0 |
| 1520.0 | 0 |
| 1521.0 | 0 |
| 1522.0 | 0 |
| 1523.0 | 0 |
| 1524.0 | 0 |
| 1525.0 | 0 |
| 1526.0 | 0 |
| 1527.0 | 0 |
| 1528.0 | 0 |
| 1529.0 | 0 |
| 1530.0 | 0 |
| 1531.0 | 0 |
| 1532.0 | 0 |
| 1533.0 | 0 |
| 1534.0 | 0 |
| 1535.0 | 0 |
| 1536.0 | 0 |
| 1537.0 | 0 |
| 1538.0 | 0 |
| 1539.0 | 0 |
| 1540.0 | 0 |
| 1541.0 | 0 |
| 1542.0 | 0 |
| 1543.0 | 0 |
| 1544.0 | 0 |
| 1545.0 | 0 |
| 1546.0 | 0 |
| 1547.0 | 0 |
| 1548.0 | 0 |
| 1549.0 | 0 |
| 1550.0 | 0 |
| 1551.0 | 0 |
| 1552.0 | 0 |
| 1553.0 | 0 |
| 1554.0 | 0 |
| 1555.0 | 0 |
| 1556.0 | 0 |
| 1557.0 | 0 |
| 1558.0 | 0 |
| 1559.0 | 0 |
| 1560.0 | 0 |
| 1561.0 | 0 |
| 1562.0 | 0 |
| 1563.0 | 0 |
| 1564.0 | 0 |
| 1565.0 | 0 |
| 1566.0 | 0 |
| 1567.0 | 0 |
| 1568.0 | 0 |
| 1569.0 | 0 |
| 1570.0 | 0 |
| 1571.0 | 0 |
| 1572.0 | 0 |
| 1573.0 | 0 |
| 1574.0 | 0 |
| 1575.0 | 0 |
| 1576.0 | 0 |
| 1577.0 | 0 |
| 1578.0 | 0 |
| 1579.0 | 0 |
| 1580.0 | 0 |
| 1581.0 | 0 |
| 1582.0 | 0 |
| 1583.0 | 0 |
| 1584.0 | 0 |
| 1585.0 | 0 |
| 1586.0 | 0 |
| 1587.0 | 0 |
| 1588.0 | 0 |
| 1589.0 | 0 |
| 1590.0 | 0 |
| 1591.0 | 0 |
| 1592.0 | 0 |
| 1593.0 | 0 |
| 1594.0 | 0 |
| 1595.0 | 0 |
| 1596.0 | 0 |
| 1597.0 | 0 |
| 1598.0 | 0 |
| 1599.0 | 0 |
| 1600.0 | 0 |
| 1601.0 | 0 |
| 1602.0 | 0 |
| 1603.0 | 0 |
| 1604.0 | 0 |
| 1605.0 | 0 |
| 1606.0 | 0 |
| 1607.0 | 0 |
| 1608.0 | 0 |
| 1609.0 | 0 |
| 1610.0 | 0 |
| 1611.0 | 0 |
| 1612.0 | 0 |
| 1613.0 | 0 |
| 1614.0 | 0 |
| 1615.0 | 0 |
| 1616.0 | 0 |
| 1617.0 | 0 |
| 1618.0 | 0 |
| 1619.0 | 0 |
| 1620.0 | 0 |
| 1621.0 | 0 |
| 1622.0 | 0 |
| 1623.0 | 0 |
| 1624.0 | 0 |
| 1625.0 | 0 |
| 1626.0 | 0 |
| 1627.0 | 0 |
| 1628.0 | 0 |
| 1629.0 | 0 |
| 1630.0 | 0 |
| 1631.0 | 0 |
| 1632.0 | 0 |
| 1633.0 | 0 |
| 1634.0 | 0 |
| 1635.0 | 0 |
| 1636.0 | 0 |
| 1637.0 | 0 |
| 1638.0 | 0 |
| 1639.0 | 0 |
| 1640.0 | 0 |
| 1641.0 | 0 |
| 1642.0 | 0 |
| 1643.0 | 0 |
| 1644.0 | 0 |
| 1645.0 | 0 |
| 1646.0 | 0 |
| 1647.0 | 0 |
| 1648.0 | 0 |
| 1649.0 | 0 |
| 1650.0 | 0 |
| 1651.0 | 0 |
| 1652.0 | 0 |
| 1653.0 | 0 |
| 1654.0 | 0 |
| 1655.0 | 0 |
| 1656.0 | 0 |
| 1657.0 | 0 |
| 1658.0 | 0 |
| 1659.0 | 0 |
| 1660.0 | 0 |
| 1661.0 | 0 |
| 1662.0 | 0 |
| 1663.0 | 0 |
| 1664.0 | 0 |
| 1665.0 | 0 |
| 1666.0 | 0 |
| 1667.0 | 0 |
| 1668.0 | 0 |
| 1669.0 | 0 |
| 1670.0 | 0 |
| 1671.0 | 0 |
| 1672.0 | 0 |
| 1673.0 | 0 |
| 1674.0 | 0 |
| 1675.0 | 0 |
| 1676.0 | 0 |
| 1677.0 | 0 |
| 1678.0 | 0 |
| 1679.0 | 0 |
| 1680.0 | 0 |
| 1681.0 | 0 |
| 1682.0 | 0 |
| 1683.0 | 0 |
| 1684.0 | 0 |
| 1685.0 | 0 |
| 1686.0 | 0 |
| 1687.0 | 0 |
| 1688.0 | 0 |
| 1689.0 | 0 |
| 1690.0 | 0 |
| 1691.0 | 0 |
| 1692.0 | 0 |
| 1693.0 | 0 |
| 1694.0 | 0 |
| 1695.0 | 0 |
| 1696.0 | 0 |
| 1697.0 | 0 |
| 1698.0 | 0 |
| 1699.0 | 0 |
| 1700.0 | 0 |
| 1701.0 | 0 |
| 1702.0 | 0 |
| 1703.0 | 0 |
| 1704.0 | 0 |
| 1705.0 | 0 |
| 1706.0 | 0 |
| 1707.0 | 0 |